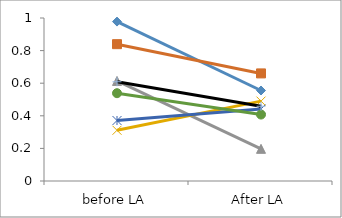
| Category | Series 0 | Series 1 | Series 2 | Series 3 | Series 4 | Series 5 | Series 6 |
|---|---|---|---|---|---|---|---|
| before LA | 0.978 | 0.839 | 0.614 | 0.311 | 0.371 | 0.539 | 0.609 |
| After LA | 0.555 | 0.66 | 0.197 | 0.49 | 0.442 | 0.408 | 0.459 |